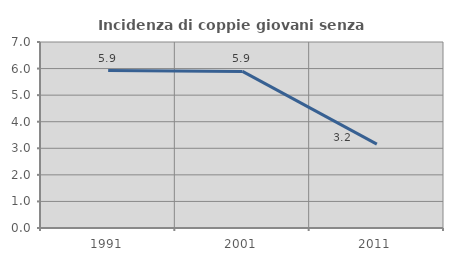
| Category | Incidenza di coppie giovani senza figli |
|---|---|
| 1991.0 | 5.926 |
| 2001.0 | 5.893 |
| 2011.0 | 3.158 |